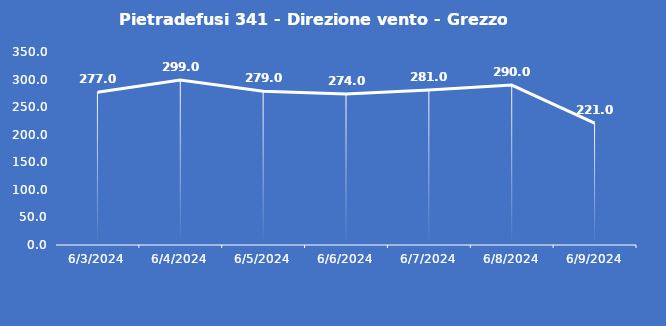
| Category | Pietradefusi 341 - Direzione vento - Grezzo (°N) |
|---|---|
| 6/3/24 | 277 |
| 6/4/24 | 299 |
| 6/5/24 | 279 |
| 6/6/24 | 274 |
| 6/7/24 | 281 |
| 6/8/24 | 290 |
| 6/9/24 | 221 |